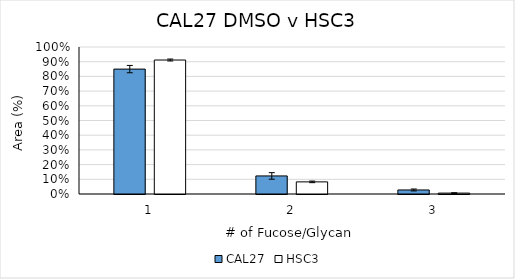
| Category | CAL27 | HSC3 |
|---|---|---|
| 0 | 0.85 | 0.911 |
| 1 | 0.123 | 0.082 |
| 2 | 0.027 | 0.006 |